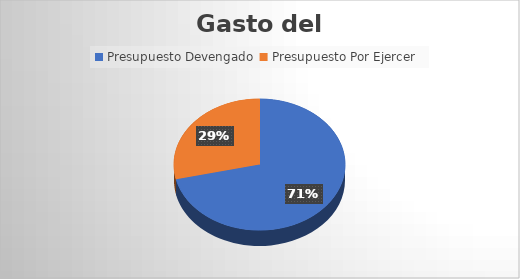
| Category | Monto  |
|---|---|
| Presupuesto Devengado  | 19034463.62 |
| Presupuesto Por Ejercer  | 7631339.61 |